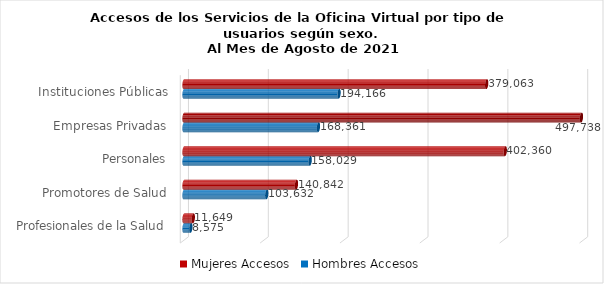
| Category | Mujeres | Hombres |
|---|---|---|
| Instituciones Públicas | 379063 | 194166 |
| Empresas Privadas | 497738 | 168361 |
| Personales | 402360 | 158029 |
| Promotores de Salud | 140842 | 103632 |
| Profesionales de la Salud | 11649 | 8575 |